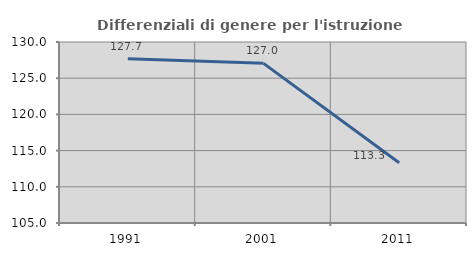
| Category | Differenziali di genere per l'istruzione superiore |
|---|---|
| 1991.0 | 127.698 |
| 2001.0 | 127.049 |
| 2011.0 | 113.333 |